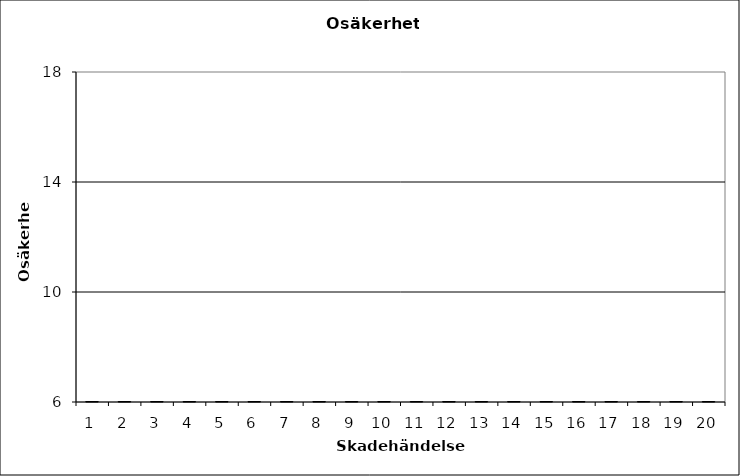
| Category | Osäkerhetspoäng |
|---|---|
| 1.0 | 0 |
| 2.0 | 0 |
| 3.0 | 0 |
| 4.0 | 0 |
| 5.0 | 0 |
| 6.0 | 0 |
| 7.0 | 0 |
| 8.0 | 0 |
| 9.0 | 0 |
| 10.0 | 0 |
| 11.0 | 0 |
| 12.0 | 0 |
| 13.0 | 0 |
| 14.0 | 0 |
| 15.0 | 0 |
| 16.0 | 0 |
| 17.0 | 0 |
| 18.0 | 0 |
| 19.0 | 0 |
| 20.0 | 0 |